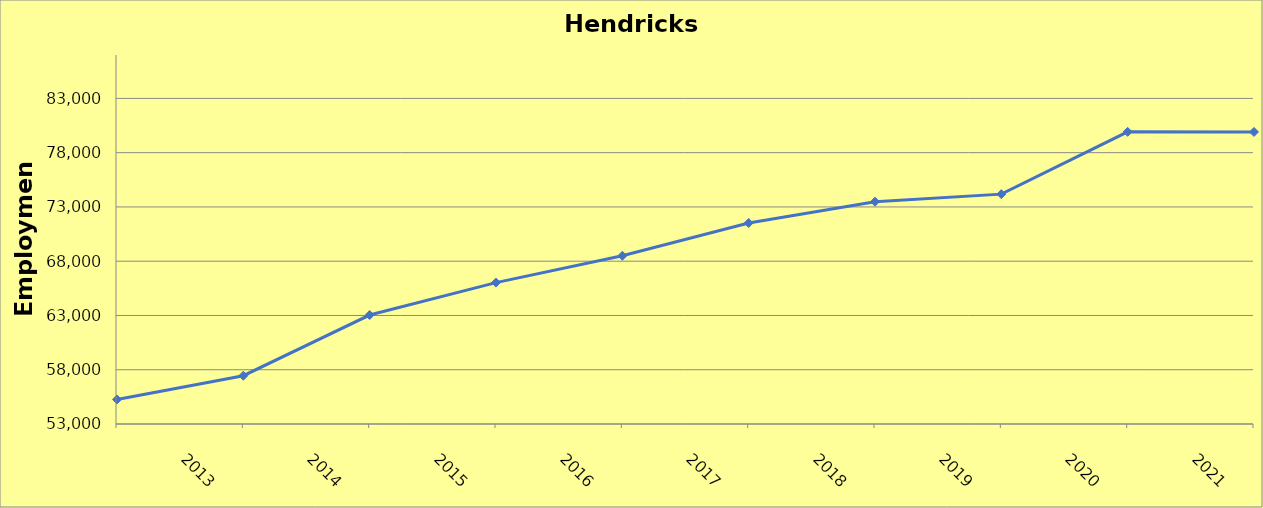
| Category | Hendricks County |
|---|---|
| 2013.0 | 55260 |
| 2014.0 | 57450 |
| 2015.0 | 63040 |
| 2016.0 | 66030 |
| 2017.0 | 68500 |
| 2018.0 | 71520 |
| 2019.0 | 73480 |
| 2020.0 | 74180 |
| 2021.0 | 79920 |
| 2022.0 | 79907 |